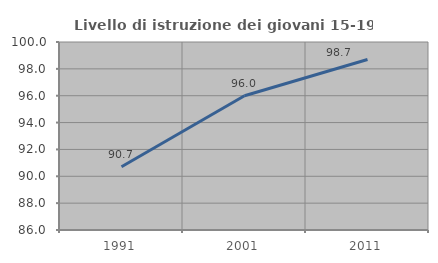
| Category | Livello di istruzione dei giovani 15-19 anni |
|---|---|
| 1991.0 | 90.714 |
| 2001.0 | 96 |
| 2011.0 | 98.701 |